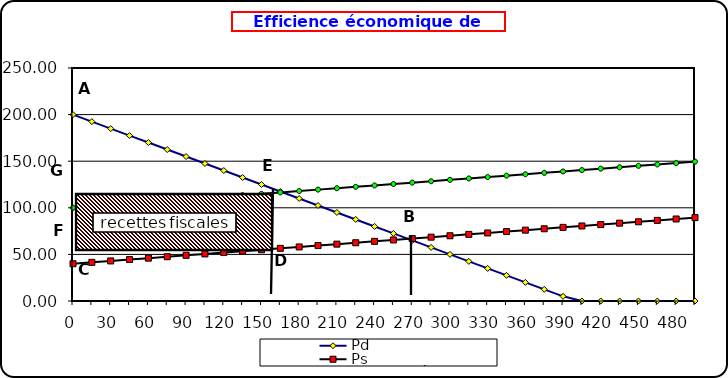
| Category | Pd | Ps | Ps + Impôt |
|---|---|---|---|
| 0.0 | 200 | 40 | 100 |
| 15.0 | 192.5 | 41.5 | 101.5 |
| 30.0 | 185 | 43 | 103 |
| 45.0 | 177.5 | 44.5 | 104.5 |
| 60.0 | 170 | 46 | 106 |
| 75.0 | 162.5 | 47.5 | 107.5 |
| 90.0 | 155 | 49 | 109 |
| 105.0 | 147.5 | 50.5 | 110.5 |
| 120.0 | 140 | 52 | 112 |
| 135.0 | 132.5 | 53.5 | 113.5 |
| 150.0 | 125 | 55 | 115 |
| 165.0 | 117.5 | 56.5 | 116.5 |
| 180.0 | 110 | 58 | 118 |
| 195.0 | 102.5 | 59.5 | 119.5 |
| 210.0 | 95 | 61 | 121 |
| 225.0 | 87.5 | 62.5 | 122.5 |
| 240.0 | 80 | 64 | 124 |
| 255.0 | 72.5 | 65.5 | 125.5 |
| 270.0 | 65 | 67 | 127 |
| 285.0 | 57.5 | 68.5 | 128.5 |
| 300.0 | 50 | 70 | 130 |
| 315.0 | 42.5 | 71.5 | 131.5 |
| 330.0 | 35 | 73 | 133 |
| 345.0 | 27.5 | 74.5 | 134.5 |
| 360.0 | 20 | 76 | 136 |
| 375.0 | 12.5 | 77.5 | 137.5 |
| 390.0 | 5 | 79 | 139 |
| 405.0 | 0 | 80.5 | 140.5 |
| 420.0 | 0 | 82 | 142 |
| 435.0 | 0 | 83.5 | 143.5 |
| 450.0 | 0 | 85 | 145 |
| 465.0 | 0 | 86.5 | 146.5 |
| 480.0 | 0 | 88 | 148 |
| 495.0 | 0 | 89.5 | 149.5 |